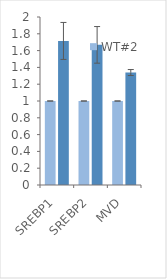
| Category | WT#2 | FDX1-KO#18 |
|---|---|---|
| SREBP1 | 1 | 1.715 |
| SREBP2 | 1 | 1.668 |
| MVD | 1 | 1.339 |